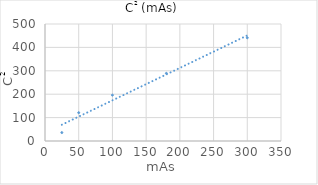
| Category | Series 0 |
|---|---|
| 25.0 | 36 |
| 50.0 | 121 |
| 100.0 | 196 |
| 180.0 | 289 |
| 300.0 | 441 |